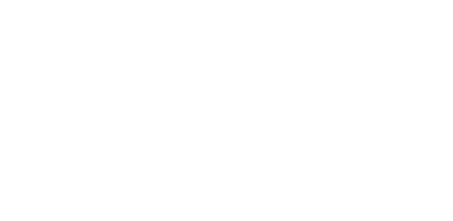
| Category | Series 0 |
|---|---|
| Not Applicable | 0 |
| Achieved | 0 |
| Denied | 0 |
| Exempted | 0 |